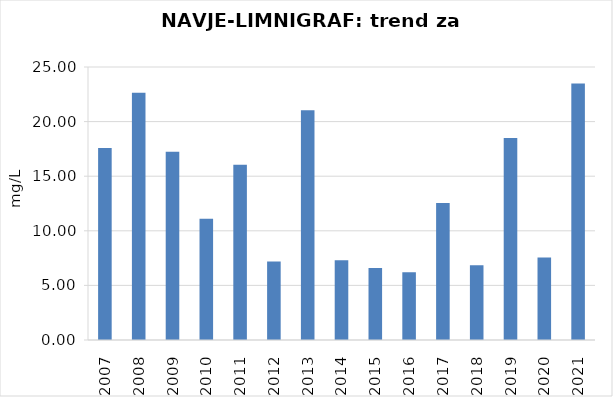
| Category | Vsota |
|---|---|
| 2007 | 17.575 |
| 2008 | 22.65 |
| 2009 | 17.25 |
| 2010 | 11.1 |
| 2011 | 16.05 |
| 2012 | 7.2 |
| 2013 | 21.05 |
| 2014 | 7.3 |
| 2015 | 6.6 |
| 2016 | 6.2 |
| 2017 | 12.55 |
| 2018 | 6.85 |
| 2019 | 18.5 |
| 2020 | 7.55 |
| 2021 | 23.5 |